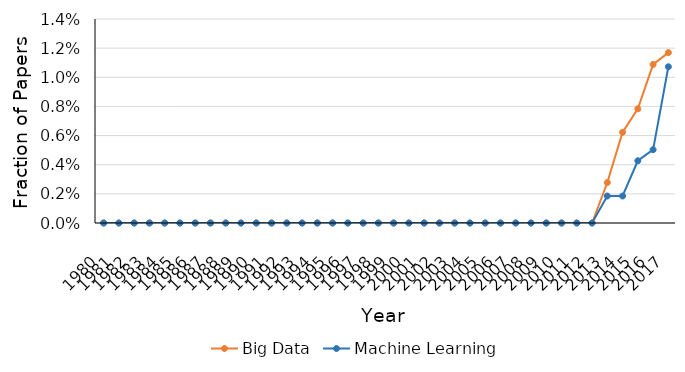
| Category | Big Data | Machine Learning |
|---|---|---|
| 1980.0 | 0 | 0 |
| 1981.0 | 0 | 0 |
| 1982.0 | 0 | 0 |
| 1983.0 | 0 | 0 |
| 1984.0 | 0 | 0 |
| 1985.0 | 0 | 0 |
| 1986.0 | 0 | 0 |
| 1987.0 | 0 | 0 |
| 1988.0 | 0 | 0 |
| 1989.0 | 0 | 0 |
| 1990.0 | 0 | 0 |
| 1991.0 | 0 | 0 |
| 1992.0 | 0 | 0 |
| 1993.0 | 0 | 0 |
| 1994.0 | 0 | 0 |
| 1995.0 | 0 | 0 |
| 1996.0 | 0 | 0 |
| 1997.0 | 0 | 0 |
| 1998.0 | 0 | 0 |
| 1999.0 | 0 | 0 |
| 2000.0 | 0 | 0 |
| 2001.0 | 0 | 0 |
| 2002.0 | 0 | 0 |
| 2003.0 | 0 | 0 |
| 2004.0 | 0 | 0 |
| 2005.0 | 0 | 0 |
| 2006.0 | 0 | 0 |
| 2007.0 | 0 | 0 |
| 2008.0 | 0 | 0 |
| 2009.0 | 0 | 0 |
| 2010.0 | 0 | 0 |
| 2011.0 | 0 | 0 |
| 2012.0 | 0 | 0 |
| 2013.0 | 0.003 | 0.002 |
| 2014.0 | 0.006 | 0.002 |
| 2015.0 | 0.008 | 0.004 |
| 2016.0 | 0.011 | 0.005 |
| 2017.0 | 0.012 | 0.011 |